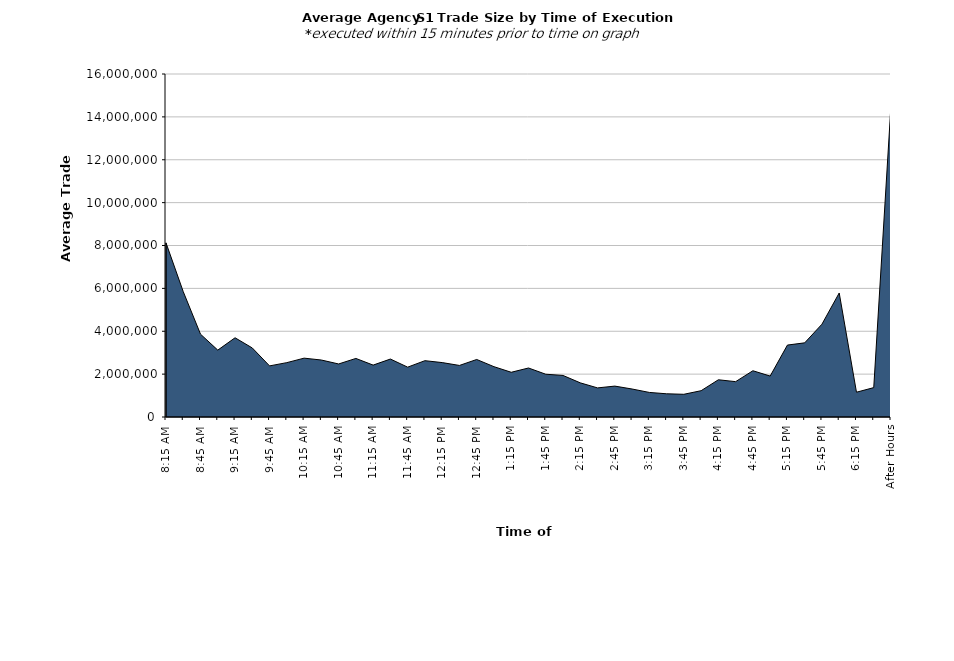
| Category | Series 0 |
|---|---|
| 8:15 AM | 8122662.587 |
| 8:30 AM | 5845240.106 |
| 8:45 AM | 3863309.1 |
| 9:00 AM | 3119597.723 |
| 9:15 AM | 3695507.799 |
| 9:30 AM | 3220560.867 |
| 9:45 AM | 2383822.712 |
| 10:00 AM | 2536197.287 |
| 10:15 AM | 2745201.976 |
| 10:30 AM | 2657448.324 |
| 10:45 AM | 2473907.327 |
| 11:00 AM | 2731969.999 |
| 11:15 AM | 2420834.713 |
| 11:30 AM | 2703693.059 |
| 11:45 AM | 2325779.838 |
| 12:00 PM | 2626843.859 |
| 12:15 PM | 2538183.609 |
| 12:30 PM | 2405246.767 |
| 12:45 PM | 2683634.38 |
| 1:00 PM | 2347511.901 |
| 1:15 PM | 2086530.872 |
| 1:30 PM | 2285903.266 |
| 1:45 PM | 1995097.101 |
| 2:00 PM | 1938559.952 |
| 2:15 PM | 1593059.869 |
| 2:30 PM | 1357159.661 |
| 2:45 PM | 1441202.695 |
| 3:00 PM | 1306028.684 |
| 3:15 PM | 1145826.558 |
| 3:30 PM | 1082441.651 |
| 3:45 PM | 1059098.538 |
| 4:00 PM | 1226788.473 |
| 4:15 PM | 1736643.399 |
| 4:30 PM | 1649101.766 |
| 4:45 PM | 2157802.881 |
| 5:00 PM | 1909120.918 |
| 5:15 PM | 3355635.821 |
| 5:30 PM | 3459728.664 |
| 5:45 PM | 4329397.01 |
| 6:00 PM | 5784385.965 |
| 6:15 PM | 1156129.032 |
| 6:30 PM | 1370294.118 |
| After Hours | 14563153.31 |